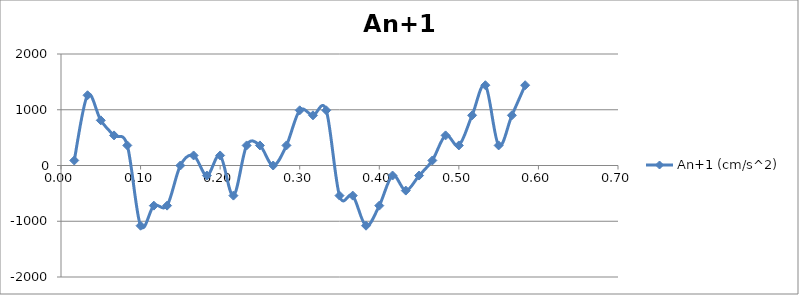
| Category | An+1 (cm/s^2) |
|---|---|
| 0.0166666666666667 | 90 |
| 0.0333333333333333 | 1260 |
| 0.05 | 810 |
| 0.0666666666666667 | 540 |
| 0.0833333333333333 | 360 |
| 0.1 | -1080 |
| 0.116666666666667 | -720 |
| 0.133333333333333 | -720 |
| 0.15 | 0 |
| 0.166666666666667 | 180 |
| 0.183333333333333 | -180 |
| 0.2 | 180 |
| 0.216666666666667 | -540 |
| 0.233333333333333 | 360 |
| 0.25 | 360 |
| 0.266666666666667 | 0 |
| 0.283333333333333 | 360 |
| 0.3 | 990 |
| 0.316666666666667 | 900 |
| 0.333333333333333 | 990 |
| 0.35 | -540 |
| 0.366666666666667 | -540 |
| 0.383333333333333 | -108 |
| 0.4 | -720 |
| 0.416666666666667 | -180 |
| 0.433333333333333 | -450 |
| 0.45 | -180 |
| 0.466666666666667 | 90 |
| 0.483333333333333 | 540 |
| 0.5 | 360 |
| 0.516666666666667 | 900 |
| 0.533333333333333 | 1440 |
| 0.55 | 360 |
| 0.566666666666667 | 900 |
| 0.583333333333333 | 1440 |